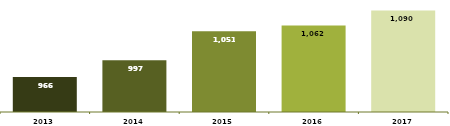
| Category | DOMICÍLIOS (Mil unidades) |
|---|---|
| 2013.0 | 965.536 |
| 2014.0 | 996.801 |
| 2015.0 | 1051 |
| 2016.0 | 1061.753 |
| 2017.0 | 1089.762 |